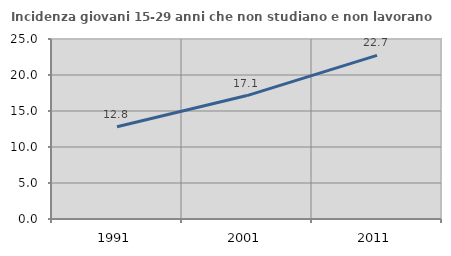
| Category | Incidenza giovani 15-29 anni che non studiano e non lavorano  |
|---|---|
| 1991.0 | 12.807 |
| 2001.0 | 17.143 |
| 2011.0 | 22.727 |